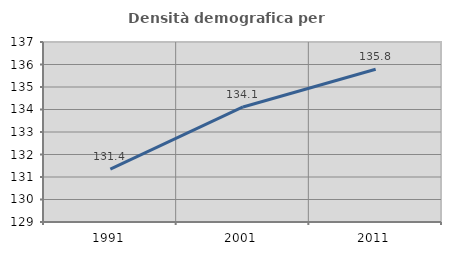
| Category | Densità demografica |
|---|---|
| 1991.0 | 131.352 |
| 2001.0 | 134.114 |
| 2011.0 | 135.79 |